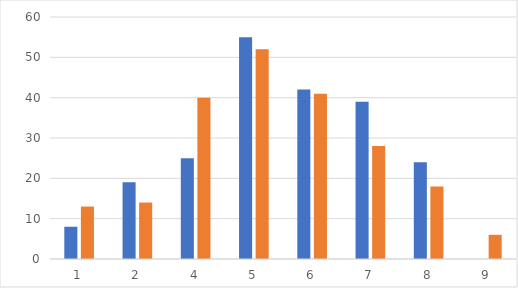
| Category | Četnost (lin) | čn |
|---|---|---|
| 1.0 | 8 | 13 |
| 2.0 | 19 | 14 |
| 4.0 | 25 | 40 |
| 5.0 | 55 | 52 |
| 6.0 | 42 | 41 |
| 7.0 | 39 | 28 |
| 8.0 | 24 | 18 |
| 9.0 | 0 | 6 |